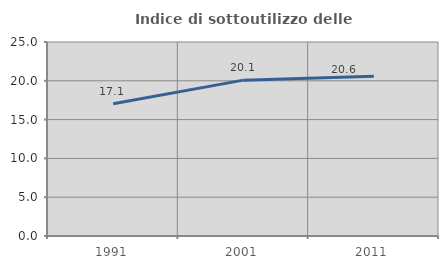
| Category | Indice di sottoutilizzo delle abitazioni  |
|---|---|
| 1991.0 | 17.055 |
| 2001.0 | 20.084 |
| 2011.0 | 20.594 |